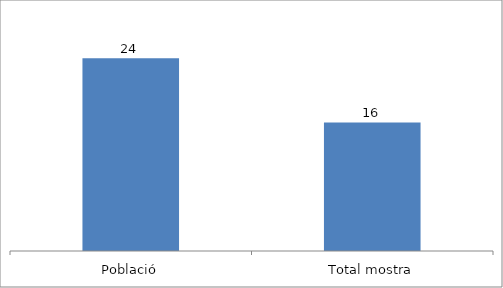
| Category | Series 0 |
|---|---|
| Població | 24 |
| Total mostra | 16 |